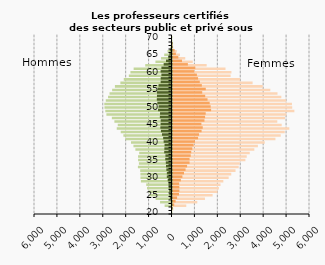
| Category | Femmes public | Femmes privé |
|---|---|---|
| 20.0 | 0 | 0 |
| 21.0 | 37 | 8 |
| 22.0 | 601 | 75 |
| 23.0 | 1082 | 135 |
| 24.0 | 1416 | 200 |
| 25.0 | 1750 | 284 |
| 26.0 | 1965 | 300 |
| 27.0 | 2024 | 298 |
| 28.0 | 2095 | 290 |
| 29.0 | 2218 | 364 |
| 30.0 | 2450 | 432 |
| 31.0 | 2564 | 502 |
| 32.0 | 2750 | 570 |
| 33.0 | 2889 | 636 |
| 34.0 | 2938 | 745 |
| 35.0 | 3181 | 745 |
| 36.0 | 3239 | 796 |
| 37.0 | 3371 | 818 |
| 38.0 | 3571 | 865 |
| 39.0 | 3726 | 920 |
| 40.0 | 4025 | 982 |
| 41.0 | 4492 | 1116 |
| 42.0 | 4723 | 1160 |
| 43.0 | 4898 | 1269 |
| 44.0 | 5098 | 1320 |
| 45.0 | 4765 | 1261 |
| 46.0 | 4573 | 1394 |
| 47.0 | 4914 | 1422 |
| 48.0 | 4971 | 1449 |
| 49.0 | 5318 | 1685 |
| 50.0 | 5224 | 1666 |
| 51.0 | 5212 | 1622 |
| 52.0 | 4965 | 1529 |
| 53.0 | 4749 | 1427 |
| 54.0 | 4582 | 1297 |
| 55.0 | 4268 | 1452 |
| 56.0 | 3939 | 1280 |
| 57.0 | 3495 | 1190 |
| 58.0 | 2951 | 1116 |
| 59.0 | 2536 | 1064 |
| 60.0 | 2571 | 952 |
| 61.0 | 2313 | 996 |
| 62.0 | 1491 | 671 |
| 63.0 | 883 | 414 |
| 64.0 | 556 | 255 |
| 65.0 | 327 | 148 |
| 66.0 | 185 | 92 |
| 67.0 | 29 | 10 |
| 68.0 | 20 | 1 |
| 69.0 | 0 | 0 |
| 70.0 | 0 | 0 |